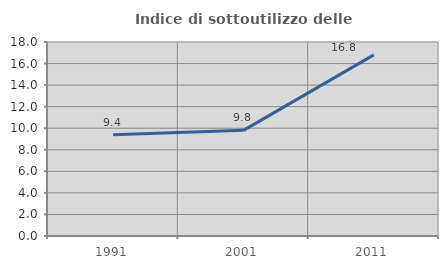
| Category | Indice di sottoutilizzo delle abitazioni  |
|---|---|
| 1991.0 | 9.39 |
| 2001.0 | 9.802 |
| 2011.0 | 16.801 |